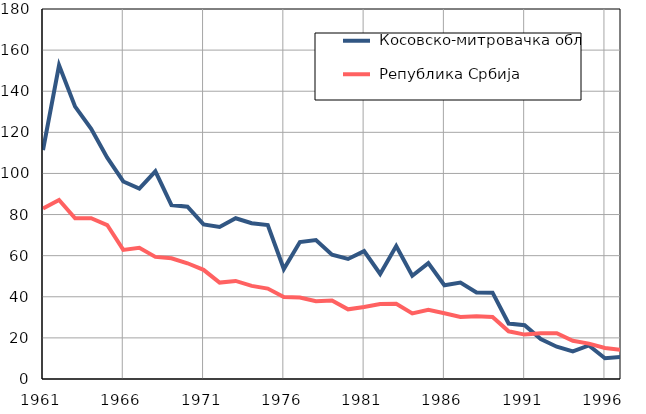
| Category |  Косовско-митровачка област |  Република Србија |
|---|---|---|
| 1961.0 | 111.4 | 82.9 |
| 1962.0 | 152.6 | 87.1 |
| 1963.0 | 132.5 | 78.2 |
| 1964.0 | 121.7 | 78.2 |
| 1965.0 | 107.7 | 74.9 |
| 1966.0 | 96.1 | 62.8 |
| 1967.0 | 92.6 | 63.8 |
| 1968.0 | 101 | 59.4 |
| 1969.0 | 84.6 | 58.7 |
| 1970.0 | 83.8 | 56.3 |
| 1971.0 | 75.2 | 53.1 |
| 1972.0 | 74 | 46.9 |
| 1973.0 | 78.2 | 47.7 |
| 1974.0 | 75.8 | 45.3 |
| 1975.0 | 74.9 | 44 |
| 1976.0 | 53.5 | 39.9 |
| 1977.0 | 66.6 | 39.6 |
| 1978.0 | 67.6 | 37.8 |
| 1979.0 | 60.5 | 38.2 |
| 1980.0 | 58.4 | 33.9 |
| 1981.0 | 62.2 | 35 |
| 1982.0 | 51.1 | 36.5 |
| 1983.0 | 64.7 | 36.6 |
| 1984.0 | 50.2 | 31.9 |
| 1985.0 | 56.4 | 33.7 |
| 1986.0 | 45.6 | 32 |
| 1987.0 | 46.9 | 30.2 |
| 1988.0 | 42.1 | 30.5 |
| 1989.0 | 42 | 30.2 |
| 1990.0 | 27 | 23.2 |
| 1991.0 | 26.2 | 21.6 |
| 1992.0 | 19.4 | 22.3 |
| 1993.0 | 15.7 | 22.3 |
| 1994.0 | 13.4 | 18.6 |
| 1995.0 | 16.3 | 17.2 |
| 1996.0 | 10.1 | 15.1 |
| 1997.0 | 10.7 | 14.2 |